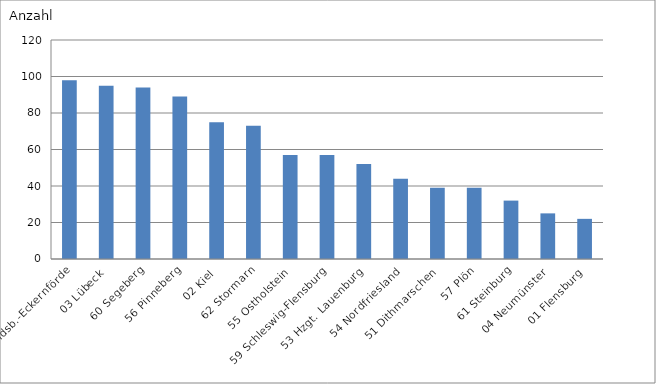
| Category | 58 Rendsb.-Eckernförde |
|---|---|
| 58 Rendsb.-Eckernförde | 98 |
| 03 Lübeck | 95 |
| 60 Segeberg | 94 |
| 56 Pinneberg | 89 |
| 02 Kiel | 75 |
| 62 Stormarn | 73 |
| 55 Ostholstein | 57 |
| 59 Schleswig-Flensburg | 57 |
| 53 Hzgt. Lauenburg | 52 |
| 54 Nordfriesland | 44 |
| 51 Dithmarschen | 39 |
| 57 Plön | 39 |
| 61 Steinburg | 32 |
| 04 Neumünster | 25 |
| 01 Flensburg | 22 |